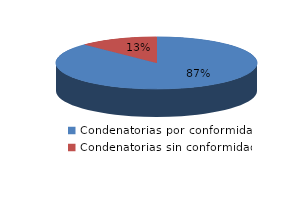
| Category | Series 0 |
|---|---|
| 0 | 4779 |
| 1 | 691 |